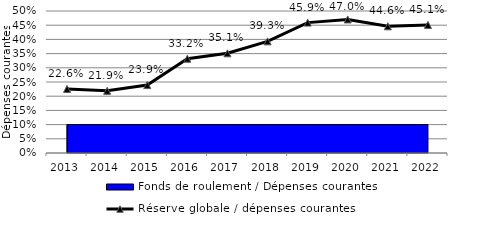
| Category | Réserve globale / dépenses courantes |
|---|---|
| 2013.0 | 0.226 |
| 2014.0 | 0.219 |
| 2015.0 | 0.239 |
| 2016.0 | 0.332 |
| 2017.0 | 0.351 |
| 2018.0 | 0.393 |
| 2019.0 | 0.459 |
| 2020.0 | 0.47 |
| 2021.0 | 0.446 |
| 2022.0 | 0.451 |